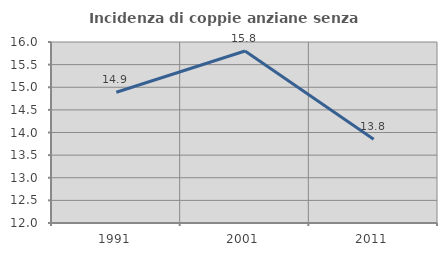
| Category | Incidenza di coppie anziane senza figli  |
|---|---|
| 1991.0 | 14.889 |
| 2001.0 | 15.801 |
| 2011.0 | 13.85 |